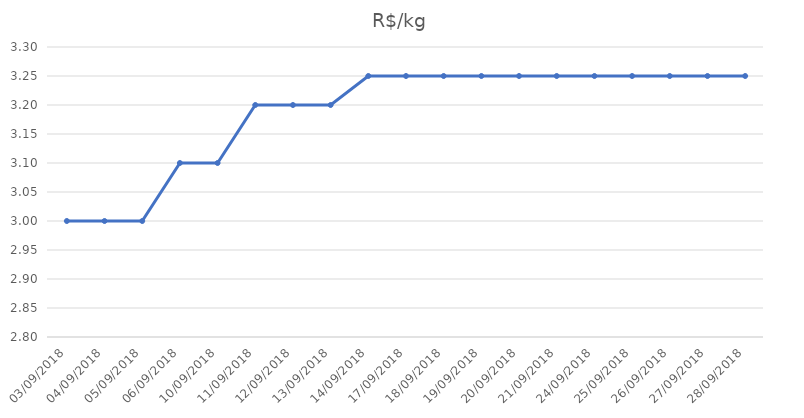
| Category | R$/kg |
|---|---|
| 03/09/2018 | 3 |
| 04/09/2018 | 3 |
| 05/09/2018 | 3 |
| 06/09/2018 | 3.1 |
| 10/09/2018 | 3.1 |
| 11/09/2018 | 3.2 |
| 12/09/2018 | 3.2 |
| 13/09/2018 | 3.2 |
| 14/09/2018 | 3.25 |
| 17/09/2018 | 3.25 |
| 18/09/2018 | 3.25 |
| 19/09/2018 | 3.25 |
| 20/09/2018 | 3.25 |
| 21/09/2018 | 3.25 |
| 24/09/2018 | 3.25 |
| 25/09/2018 | 3.25 |
| 26/09/2018 | 3.25 |
| 27/09/2018 | 3.25 |
| 28/09/2018 | 3.25 |